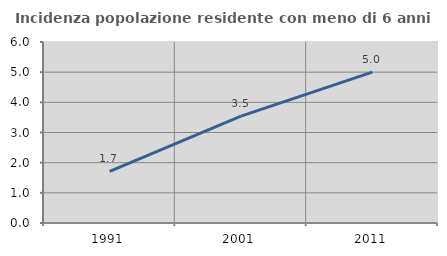
| Category | Incidenza popolazione residente con meno di 6 anni |
|---|---|
| 1991.0 | 1.711 |
| 2001.0 | 3.542 |
| 2011.0 | 5 |